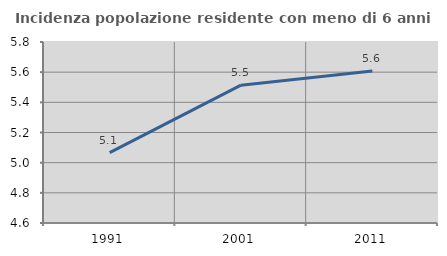
| Category | Incidenza popolazione residente con meno di 6 anni |
|---|---|
| 1991.0 | 5.066 |
| 2001.0 | 5.514 |
| 2011.0 | 5.608 |